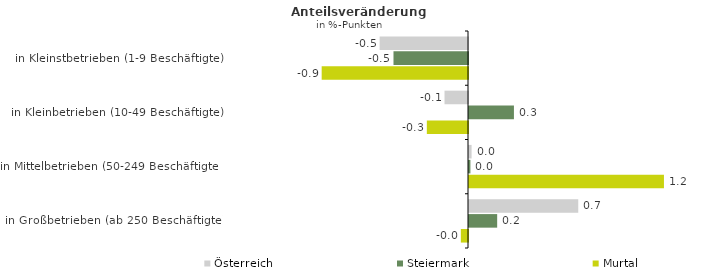
| Category | Österreich | Steiermark | Murtal |
|---|---|---|---|
| in Kleinstbetrieben (1-9 Beschäftigte) | -0.55 | -0.464 | -0.911 |
| in Kleinbetrieben (10-49 Beschäftigte) | -0.146 | 0.28 | -0.256 |
| in Mittelbetrieben (50-249 Beschäftigte) | 0.016 | 0.009 | 1.213 |
| in Großbetrieben (ab 250 Beschäftigte) | 0.68 | 0.175 | -0.045 |